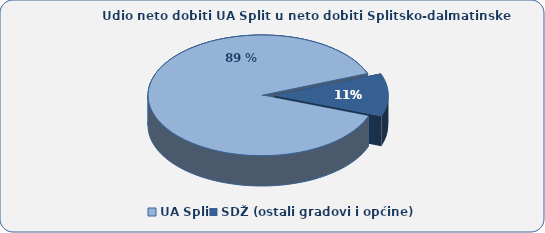
| Category | Series 0 |
|---|---|
| UA Split | 88.538 |
| SDŽ (ostali gradovi i općine) | 11.462 |